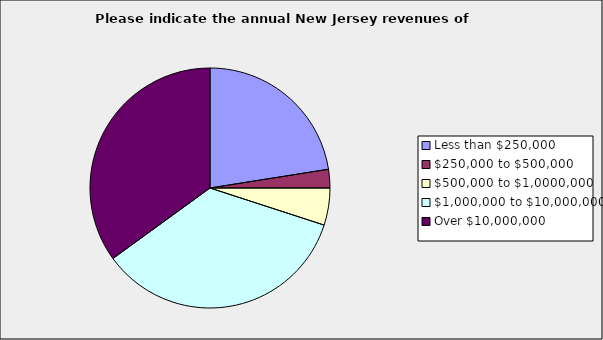
| Category | Series 0 |
|---|---|
| Less than $250,000 | 0.225 |
| $250,000 to $500,000 | 0.025 |
| $500,000 to $1,0000,000 | 0.05 |
| $1,000,000 to $10,000,000 | 0.35 |
| Over $10,000,000 | 0.35 |